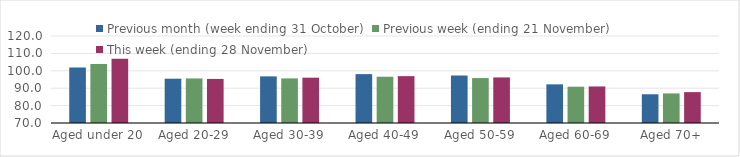
| Category | Previous month (week ending 31 October) | Previous week (ending 21 November) | This week (ending 28 November) |
|---|---|---|---|
| Aged under 20 | 101.9 | 103.84 | 106.94 |
| Aged 20-29 | 95.46 | 95.6 | 95.33 |
| Aged 30-39 | 96.79 | 95.63 | 96.04 |
| Aged 40-49 | 98.09 | 96.59 | 96.93 |
| Aged 50-59 | 97.29 | 95.82 | 96.19 |
| Aged 60-69 | 92.21 | 90.86 | 91 |
| Aged 70+ | 86.51 | 87 | 87.75 |